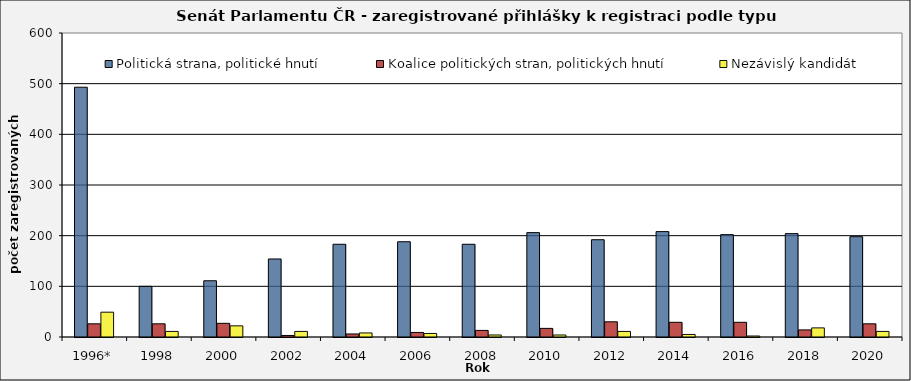
| Category | Politická strana, politické hnutí  | Koalice politických stran, politických hnutí | Nezávislý kandidát |
|---|---|---|---|
| 1996* | 493 | 26 | 49 |
| 1998 | 100 | 26 | 11 |
| 2000 | 111 | 27 | 22 |
| 2002 | 154 | 3 | 11 |
| 2004 | 183 | 6 | 8 |
| 2006 | 188 | 9 | 7 |
| 2008 | 183 | 13 | 4 |
| 2010 | 206 | 17 | 4 |
| 2012 | 192 | 30 | 11 |
| 2014 | 208 | 29 | 5 |
| 2016 | 202 | 29 | 2 |
| 2018 | 204 | 14 | 18 |
| 2020 | 198 | 26 | 11 |